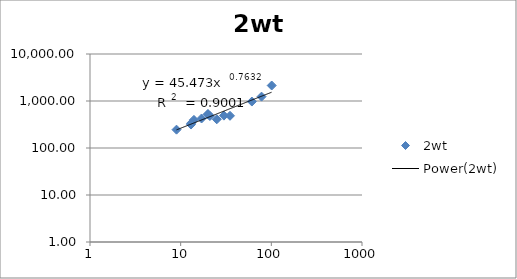
| Category | 2wt |
|---|---|
| 101.0 | 2136.8 |
| 78.0 | 1238.65 |
| 61.0 | 973.31 |
| 35.0 | 484.49 |
| 30.0 | 488.39 |
| 25.0 | 408.32 |
| 21.0 | 479.54 |
| 20.0 | 528.03 |
| 20.0 | 521.23 |
| 17.0 | 424.33 |
| 14.0 | 396.52 |
| 13.0 | 315.43 |
| 13.0 | 333.58 |
| 9.0 | 245.59 |